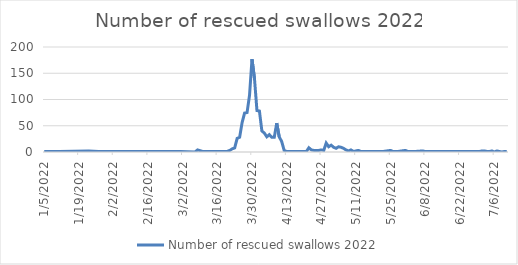
| Category | Number of rescued swallows 2022 |
|---|---|
| 1/5/22 | 1 |
| 1/11/22 | 1 |
| 1/23/22 | 2 |
| 1/27/22 | 1 |
| 2/1/22 | 1 |
| 2/27/22 | 1 |
| 3/1/22 | 1 |
| 3/7/22 | 0 |
| 3/8/22 | 4 |
| 3/10/22 | 1 |
| 3/17/22 | 1 |
| 3/18/22 | 1 |
| 3/19/22 | 1 |
| 3/20/22 | 1 |
| 3/21/22 | 3 |
| 3/22/22 | 6 |
| 3/23/22 | 8 |
| 3/24/22 | 26 |
| 3/25/22 | 28 |
| 3/26/22 | 56 |
| 3/27/22 | 74 |
| 3/28/22 | 75 |
| 3/29/22 | 108 |
| 3/30/22 | 177 |
| 3/31/22 | 140 |
| 4/1/22 | 79 |
| 4/2/22 | 78 |
| 4/3/22 | 40 |
| 4/4/22 | 36 |
| 4/5/22 | 29 |
| 4/6/22 | 33 |
| 4/7/22 | 28 |
| 4/8/22 | 28 |
| 4/9/22 | 55 |
| 4/10/22 | 29 |
| 4/11/22 | 20 |
| 4/12/22 | 3 |
| 4/13/22 | 1 |
| 4/14/22 | 1 |
| 4/16/22 | 1 |
| 4/17/22 | 1 |
| 4/18/22 | 1 |
| 4/21/22 | 1 |
| 4/22/22 | 8 |
| 4/23/22 | 4 |
| 4/24/22 | 3 |
| 4/25/22 | 3 |
| 4/26/22 | 3 |
| 4/27/22 | 4 |
| 4/28/22 | 3 |
| 4/29/22 | 17 |
| 4/30/22 | 10 |
| 5/1/22 | 13 |
| 5/2/22 | 9 |
| 5/3/22 | 7 |
| 5/4/22 | 10 |
| 5/5/22 | 9 |
| 5/6/22 | 7 |
| 5/7/22 | 4 |
| 5/8/22 | 2 |
| 5/9/22 | 4 |
| 5/10/22 | 1 |
| 5/12/22 | 3 |
| 5/13/22 | 1 |
| 5/18/22 | 1 |
| 5/21/22 | 1 |
| 5/22/22 | 1 |
| 5/25/22 | 3 |
| 5/26/22 | 1 |
| 5/27/22 | 1 |
| 5/28/22 | 1 |
| 5/31/22 | 3 |
| 6/1/22 | 1 |
| 6/4/22 | 1 |
| 6/7/22 | 2 |
| 6/8/22 | 1 |
| 6/23/22 | 1 |
| 6/25/22 | 1 |
| 6/29/22 | 1 |
| 6/30/22 | 1 |
| 7/1/22 | 2 |
| 7/2/22 | 2 |
| 7/3/22 | 1 |
| 7/4/22 | 1 |
| 7/5/22 | 2 |
| 7/6/22 | 0 |
| 7/7/22 | 2 |
| 7/8/22 | 1 |
| 7/9/22 | 0 |
| 7/10/22 | 1 |
| 7/11/22 | 1 |